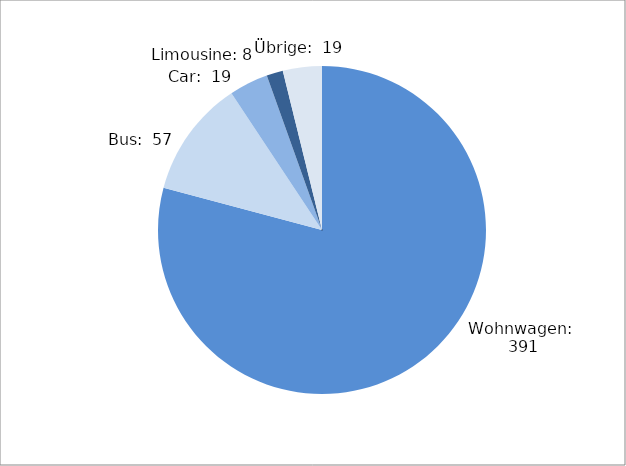
| Category | Series 0 |
|---|---|
| Wohnwagen | 391 |
| Bus | 57 |
| Car | 19 |
| Limousine | 8 |
| Übrige | 19 |